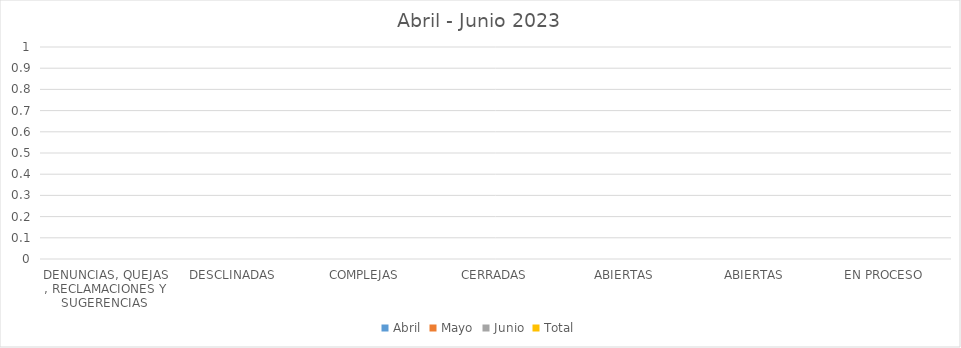
| Category | Abril | Mayo | Junio | Total |
|---|---|---|---|---|
| DENUNCIAS, QUEJAS , RECLAMACIONES Y SUGERENCIAS  | 0 | 0 | 0 | 0 |
| DESCLINADAS  | 0 | 0 | 0 | 0 |
| COMPLEJAS | 0 | 0 | 0 | 0 |
| CERRADAS | 0 | 0 | 0 | 0 |
| ABIERTAS | 0 | 0 | 0 | 0 |
| ABIERTAS | 0 | 0 | 0 | 0 |
| EN PROCESO | 0 | 0 | 0 | 0 |